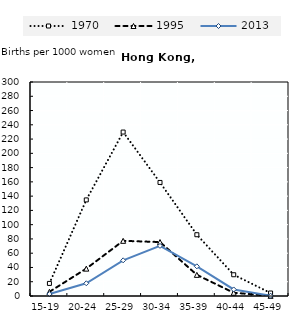
| Category | 1970 | 1995 | 2013 |
|---|---|---|---|
| 15-19 | 17.652 | 5.852 | 2.692 |
| 20-24 | 134.698 | 38.359 | 17.813 |
| 25-29 | 229.823 | 77.331 | 50.001 |
| 30-34 | 159.187 | 75.629 | 70.271 |
| 35-39 | 85.902 | 29.624 | 41.596 |
| 40-44 | 29.798 | 4.577 | 9.169 |
| 45-49 | 4.194 | 0.231 | 0.436 |